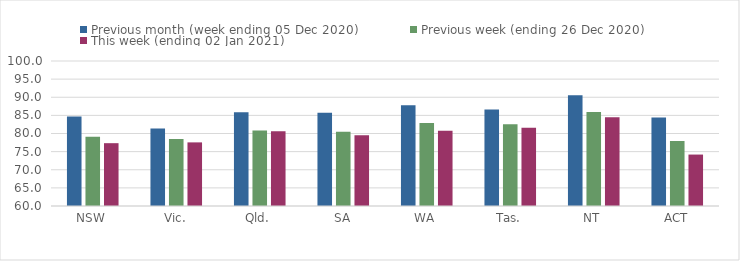
| Category | Previous month (week ending 05 Dec 2020) | Previous week (ending 26 Dec 2020) | This week (ending 02 Jan 2021) |
|---|---|---|---|
| NSW | 84.72 | 79.11 | 77.33 |
| Vic. | 81.36 | 78.46 | 77.55 |
| Qld. | 85.87 | 80.84 | 80.64 |
| SA | 85.72 | 80.47 | 79.54 |
| WA | 87.78 | 82.87 | 80.76 |
| Tas. | 86.63 | 82.56 | 81.62 |
| NT | 90.54 | 85.93 | 84.48 |
| ACT | 84.42 | 77.91 | 74.19 |